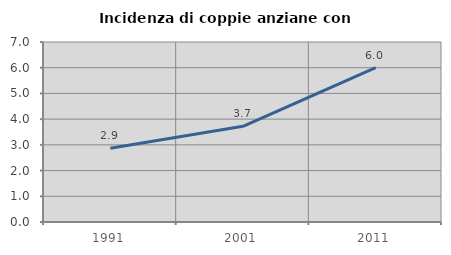
| Category | Incidenza di coppie anziane con figli |
|---|---|
| 1991.0 | 2.865 |
| 2001.0 | 3.723 |
| 2011.0 | 6.005 |